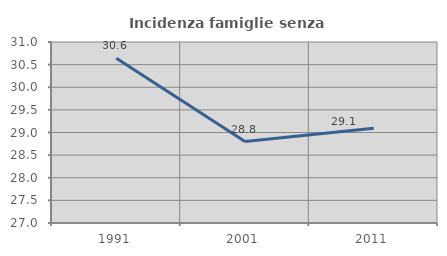
| Category | Incidenza famiglie senza nuclei |
|---|---|
| 1991.0 | 30.641 |
| 2001.0 | 28.799 |
| 2011.0 | 29.095 |